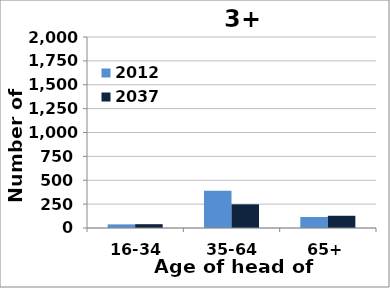
| Category | 2012 | 2037 |
|---|---|---|
| 16-34 | 38 | 40 |
| 35-64 | 389 | 248 |
| 65+ | 115 | 128 |